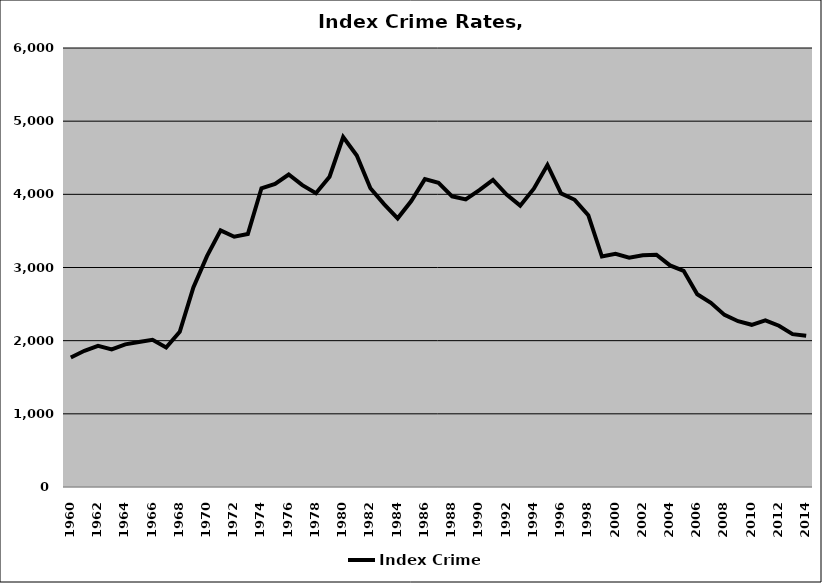
| Category | Index Crime |
|---|---|
| 1960.0 | 1771.007 |
| 1961.0 | 1862.281 |
| 1962.0 | 1928.51 |
| 1963.0 | 1880.224 |
| 1964.0 | 1949.711 |
| 1965.0 | 1982.514 |
| 1966.0 | 2011.383 |
| 1967.0 | 1905.722 |
| 1968.0 | 2121.418 |
| 1969.0 | 2728.273 |
| 1970.0 | 3154.803 |
| 1971.0 | 3507.514 |
| 1972.0 | 3420.37 |
| 1973.0 | 3457.792 |
| 1974.0 | 4082.603 |
| 1975.0 | 4141.098 |
| 1976.0 | 4270.517 |
| 1977.0 | 4124.854 |
| 1978.0 | 4014.806 |
| 1979.0 | 4240.773 |
| 1980.0 | 4782.176 |
| 1981.0 | 4530.761 |
| 1982.0 | 4083.212 |
| 1983.0 | 3865.824 |
| 1984.0 | 3671.628 |
| 1985.0 | 3908.06 |
| 1986.0 | 4206.979 |
| 1987.0 | 4156.313 |
| 1988.0 | 3972.973 |
| 1989.0 | 3930.966 |
| 1990.0 | 4057.119 |
| 1991.0 | 4195.765 |
| 1992.0 | 3996.157 |
| 1993.0 | 3845.132 |
| 1994.0 | 4076.964 |
| 1995.0 | 4401.462 |
| 1996.0 | 4012.532 |
| 1997.0 | 3925.207 |
| 1998.0 | 3714.646 |
| 1999.0 | 3150.036 |
| 2000.0 | 3186.205 |
| 2001.0 | 3134.368 |
| 2002.0 | 3167.764 |
| 2003.0 | 3175.049 |
| 2004.0 | 3028.442 |
| 2005.0 | 2954.175 |
| 2006.0 | 2633.817 |
| 2007.0 | 2517.137 |
| 2008.0 | 2352.2 |
| 2009.0 | 2265.816 |
| 2010.0 | 2216.854 |
| 2011.0 | 2277.957 |
| 2012.0 | 2204.388 |
| 2013.0 | 2089.54 |
| 2014.0 | 2066.977 |